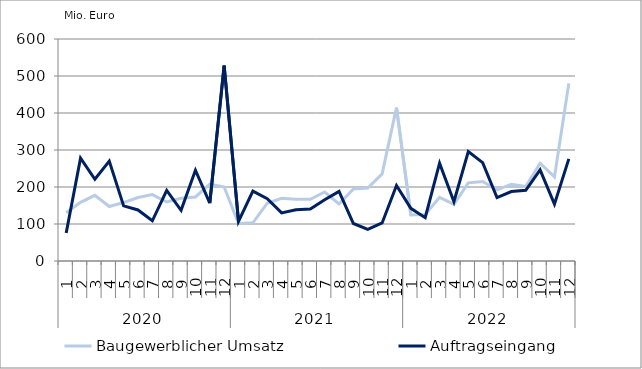
| Category | Baugewerblicher Umsatz | Auftragseingang |
|---|---|---|
| 0 | 130445.562 | 75891.481 |
| 1 | 158433.655 | 277923.85 |
| 2 | 177529.832 | 220973.626 |
| 3 | 147259.799 | 269936.091 |
| 4 | 157965.891 | 149072.895 |
| 5 | 171647.778 | 137984.76 |
| 6 | 179530.732 | 108645.965 |
| 7 | 159480.457 | 190771.468 |
| 8 | 169638.111 | 136988.906 |
| 9 | 173040.053 | 245341.603 |
| 10 | 207619.085 | 156647.224 |
| 11 | 199947.086 | 528166.004 |
| 12 | 101295.895 | 106850.127 |
| 13 | 103236.543 | 188883.434 |
| 14 | 156172.725 | 168204.42 |
| 15 | 169257.088 | 130052.073 |
| 16 | 166897.821 | 138492.214 |
| 17 | 166720.216 | 140262.426 |
| 18 | 186515.191 | 165331.191 |
| 19 | 154188.941 | 188169.655 |
| 20 | 194464.12 | 101359.538 |
| 21 | 197281.201 | 85626.862 |
| 22 | 235325.083 | 102880.924 |
| 23 | 414469.471 | 203900.676 |
| 24 | 124217.549 | 142351.759 |
| 25 | 125619.696 | 117194.423 |
| 26 | 171896.664 | 264509.013 |
| 27 | 153384.654 | 160146.519 |
| 28 | 211335.38 | 295997.826 |
| 29 | 214914.164 | 265813.917 |
| 30 | 192047.613 | 171529.517 |
| 31 | 207577.681 | 187809.656 |
| 32 | 201109.781 | 190941.096 |
| 33 | 264135.048 | 246250.021 |
| 34 | 227299.047 | 153783.993 |
| 35 | 480026.589 | 276019.328 |